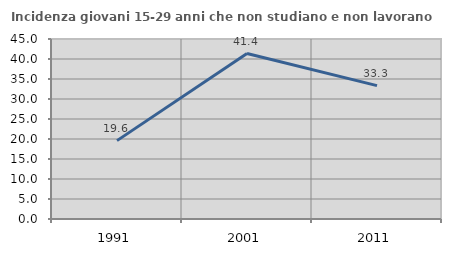
| Category | Incidenza giovani 15-29 anni che non studiano e non lavorano  |
|---|---|
| 1991.0 | 19.595 |
| 2001.0 | 41.358 |
| 2011.0 | 33.333 |